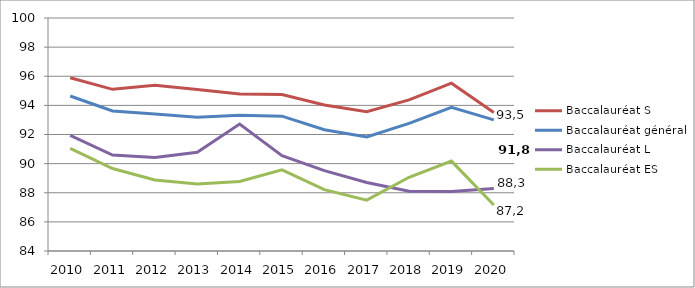
| Category | Baccalauréat S | Baccalauréat général | Baccalauréat L | Baccalauréat ES |
|---|---|---|---|---|
| 2010.0 | 95.894 | 94.642 | 91.944 | 91.049 |
| 2011.0 | 95.102 | 93.616 | 90.59 | 89.66 |
| 2012.0 | 95.382 | 93.405 | 90.428 | 88.88 |
| 2013.0 | 95.095 | 93.19 | 90.782 | 88.595 |
| 2014.0 | 94.789 | 93.327 | 92.722 | 88.773 |
| 2015.0 | 94.744 | 93.261 | 90.541 | 89.575 |
| 2016.0 | 94.028 | 92.327 | 89.522 | 88.211 |
| 2017.0 | 93.569 | 91.827 | 88.7 | 87.494 |
| 2018.0 | 94.373 | 92.759 | 88.1 | 89.064 |
| 2019.0 | 95.523 | 93.862 | 88.079 | 90.174 |
| 2020.0 | 93.514 | 93.003 | 88.299 | 87.155 |